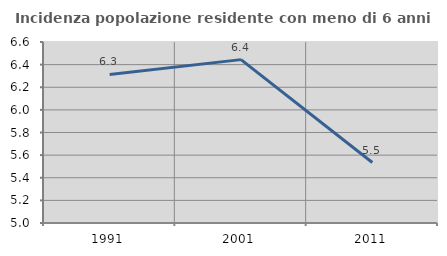
| Category | Incidenza popolazione residente con meno di 6 anni |
|---|---|
| 1991.0 | 6.313 |
| 2001.0 | 6.444 |
| 2011.0 | 5.535 |